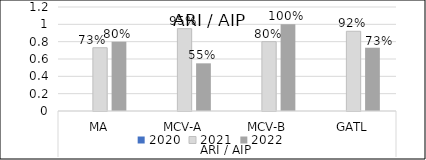
| Category | 2020 | 2021 | 2022 |
|---|---|---|---|
| 0 | 0 | 0.73 | 0.8 |
| 1 | 0 | 0.95 | 0.55 |
| 2 | 0 | 0.8 | 1 |
| 3 | 0 | 0.92 | 0.73 |